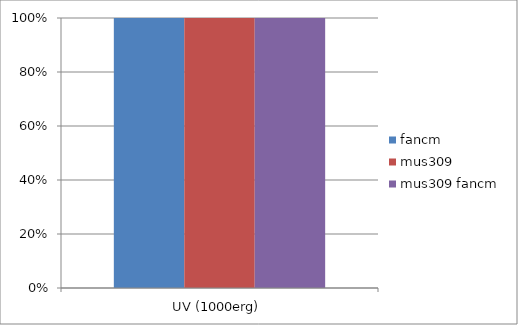
| Category | No drug | fancm | mus309 | mus309 fancm |
|---|---|---|---|---|
| 0 |  | 1 | 1 | 1 |